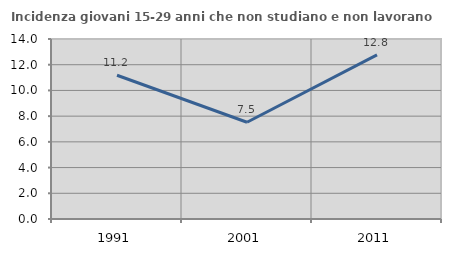
| Category | Incidenza giovani 15-29 anni che non studiano e non lavorano  |
|---|---|
| 1991.0 | 11.182 |
| 2001.0 | 7.527 |
| 2011.0 | 12.766 |